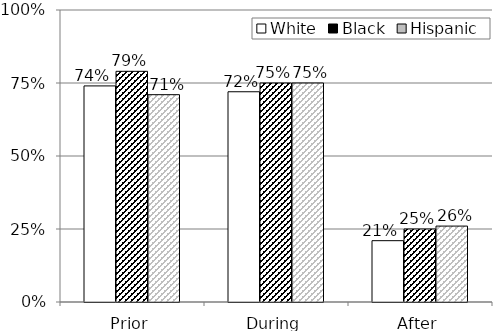
| Category | White | Black | Hispanic |
|---|---|---|---|
| Prior | 0.74 | 0.79 | 0.71 |
| During | 0.72 | 0.75 | 0.75 |
| After | 0.21 | 0.25 | 0.26 |